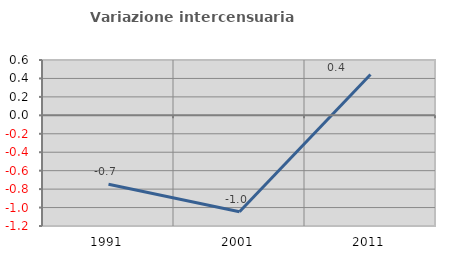
| Category | Variazione intercensuaria annua |
|---|---|
| 1991.0 | -0.747 |
| 2001.0 | -1.046 |
| 2011.0 | 0.442 |